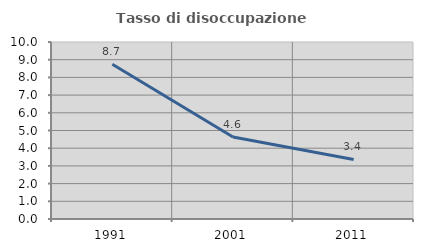
| Category | Tasso di disoccupazione giovanile  |
|---|---|
| 1991.0 | 8.748 |
| 2001.0 | 4.632 |
| 2011.0 | 3.364 |